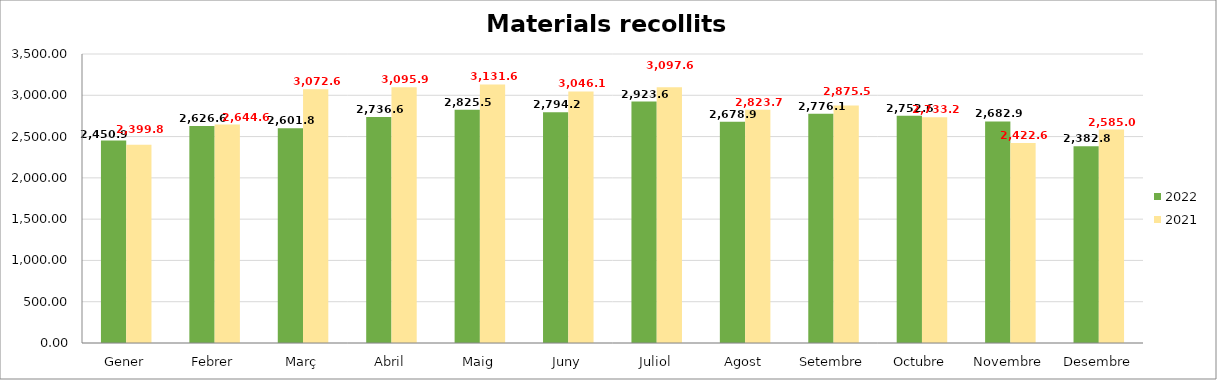
| Category | 2022 | 2021 |
|---|---|---|
| Gener | 2450.973 | 2399.883 |
| Febrer | 2626.691 | 2644.682 |
| Març | 2601.82 | 3072.66 |
| Abril | 2736.664 | 3095.99 |
| Maig | 2825.502 | 3131.673 |
| Juny | 2794.26 | 3046.175 |
| Juliol | 2923.684 | 3097.668 |
| Agost | 2678.994 | 2823.783 |
| Setembre | 2776.129 | 2875.583 |
| Octubre | 2752.669 | 2733.205 |
| Novembre | 2682.927 | 2422.617 |
| Desembre | 2382.797 | 2585.032 |